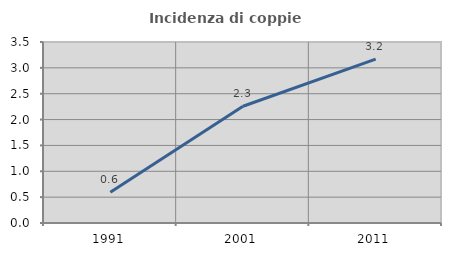
| Category | Incidenza di coppie miste |
|---|---|
| 1991.0 | 0.593 |
| 2001.0 | 2.258 |
| 2011.0 | 3.168 |